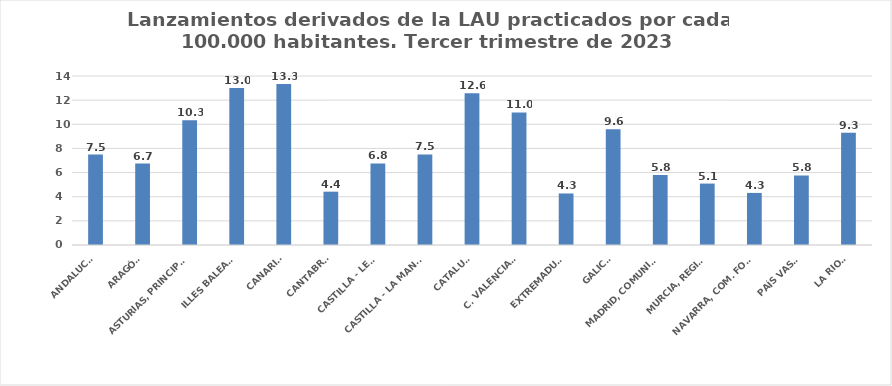
| Category | Series 0 |
|---|---|
| ANDALUCÍA | 7.49 |
| ARAGÓN | 6.744 |
| ASTURIAS, PRINCIPADO | 10.332 |
| ILLES BALEARS | 13.01 |
| CANARIAS | 13.331 |
| CANTABRIA | 4.418 |
| CASTILLA - LEÓN | 6.757 |
| CASTILLA - LA MANCHA | 7.498 |
| CATALUÑA | 12.571 |
| C. VALENCIANA | 10.981 |
| EXTREMADURA | 4.268 |
| GALICIA | 9.594 |
| MADRID, COMUNIDAD | 5.797 |
| MURCIA, REGIÓN | 5.088 |
| NAVARRA, COM. FORAL | 4.314 |
| PAÍS VASCO | 5.766 |
| LA RIOJA | 9.309 |